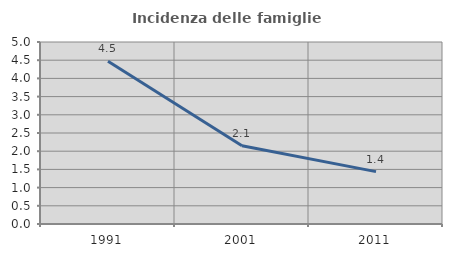
| Category | Incidenza delle famiglie numerose |
|---|---|
| 1991.0 | 4.471 |
| 2001.0 | 2.148 |
| 2011.0 | 1.439 |